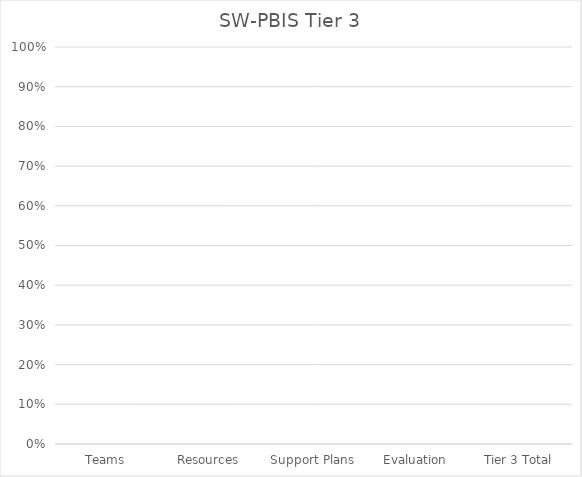
| Category | Series 0 |
|---|---|
| Teams | 0 |
| Resources | 0 |
| Support Plans | 0 |
| Evaluation | 0 |
| Tier 3 Total | 0 |